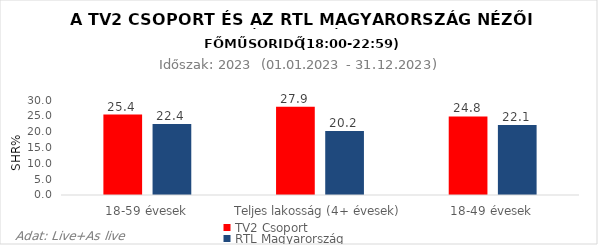
| Category | TV2 Csoport | RTL Magyarország |
|---|---|---|
| 18-59 évesek | 25.4 | 22.4 |
| Teljes lakosság (4+ évesek) | 27.9 | 20.2 |
| 18-49 évesek | 24.8 | 22.1 |